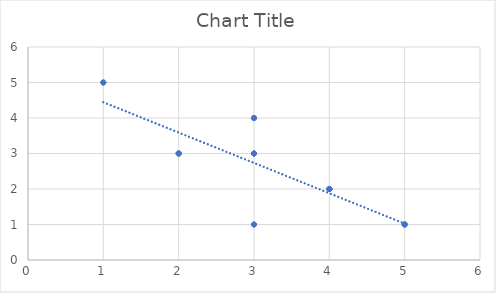
| Category | Series 0 |
|---|---|
| 1.0 | 5 |
| 1.0 | 5 |
| 2.0 | 3 |
| 2.0 | 3 |
| 2.0 | 3 |
| 3.0 | 1 |
| 3.0 | 1 |
| 3.0 | 3 |
| 3.0 | 3 |
| 3.0 | 3 |
| 3.0 | 3 |
| 3.0 | 4 |
| 3.0 | 4 |
| 4.0 | 2 |
| 4.0 | 2 |
| 4.0 | 2 |
| 4.0 | 2 |
| 4.0 | 2 |
| 5.0 | 1 |
| 5.0 | 1 |
| 5.0 | 1 |